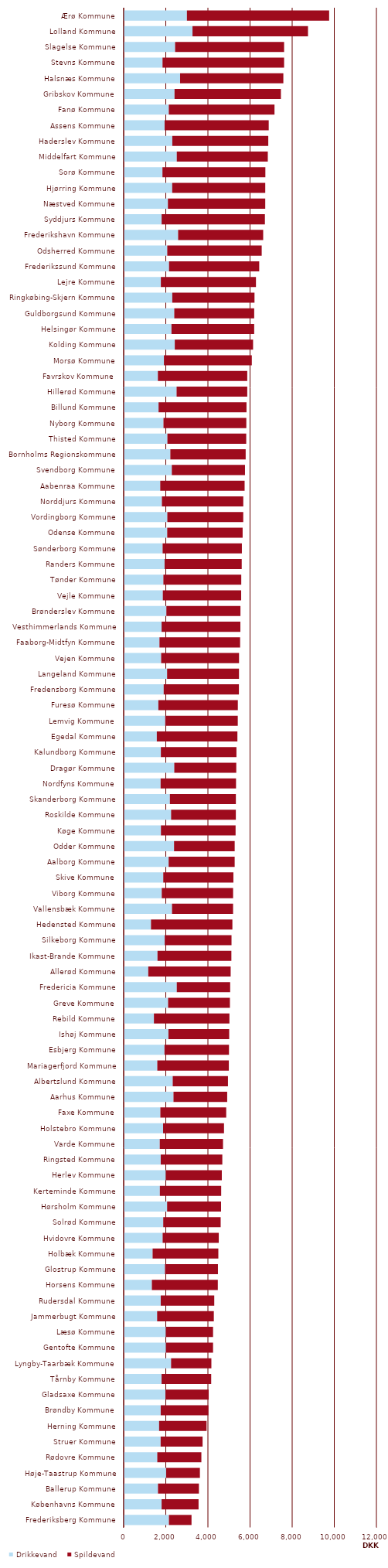
| Category | Drikkevand  | Spildevand  |
|---|---|---|
| Ærø Kommune | 3003.023 | 6752.506 |
| Lolland Kommune | 3268.256 | 5483.514 |
| Slagelse Kommune | 2441.804 | 5175.673 |
| Stevns Kommune | 1844.837 | 5772.29 |
| Halsnæs Kommune | 2679.196 | 4902.446 |
| Gribskov Kommune | 2414.707 | 5050.891 |
| Fanø Kommune | 2141.904 | 5019.664 |
| Assens Kommune | 1943.949 | 4943.091 |
| Haderslev Kommune | 2309.295 | 4556.58 |
| Middelfart Kommune | 2521.702 | 4321.898 |
| Sorø Kommune | 1841.438 | 4886.076 |
| Hjørring Kommune | 2304.075 | 4418.532 |
| Næstved Kommune | 2100.276 | 4621.734 |
| Syddjurs Kommune | 1801.879 | 4904.085 |
| Frederikshavn Kommune | 2585.25 | 4038.69 |
| Odsherred Kommune | 2069.411 | 4484.218 |
| Frederikssund Kommune | 2153.869 | 4282.039 |
| Lejre Kommune | 1765.447 | 4515.634 |
| Ringkøbing-Skjern Kommune | 2308.084 | 3903.972 |
| Guldborgsund Kommune | 2402.394 | 3795.178 |
| Helsingør Kommune | 2269.515 | 3927.238 |
| Kolding Kommune | 2426.442 | 3717.963 |
| Morsø Kommune | 1911.782 | 4172.805 |
| Favrskov Kommune | 1624.23 | 4243.668 |
| Hillerød Kommune | 2512.826 | 3354.86 |
| Billund Kommune | 1656.771 | 4175.118 |
| Nyborg Kommune | 1890.137 | 3933.49 |
| Thisted Kommune | 2076.008 | 3743.18 |
| Bornholms Regionskommune | 2215.985 | 3576.889 |
| Svendborg Kommune | 2285.736 | 3474.988 |
| Aabenraa Kommune | 1736.648 | 4006.07 |
| Norddjurs Kommune | 1814.651 | 3864.794 |
| Vordingborg Kommune | 2072.612 | 3604.86 |
| Odense Kommune | 2067.35 | 3581.269 |
| Sønderborg Kommune | 1849.519 | 3763.734 |
| Randers Kommune | 1942.928 | 3662.438 |
| Tønder Kommune | 1885.963 | 3697.246 |
| Vejle Kommune | 1858.741 | 3720.072 |
| Brønderslev Kommune | 2027.016 | 3518.409 |
| Vesthimmerlands Kommune | 1800.407 | 3741.047 |
| Faaborg-Midtfyn Kommune | 1699.734 | 3829.148 |
| Vejen Kommune | 1779.517 | 3698.406 |
| Langeland Kommune | 2062.023 | 3413.324 |
| Fredensborg Kommune | 1899.569 | 3572.087 |
| Furesø Kommune | 1646.702 | 3774.217 |
| Lemvig Kommune | 1972.523 | 3445.399 |
| Egedal Kommune | 1573.229 | 3826.637 |
| Kalundborg Kommune | 1766.055 | 3588.652 |
| Dragør Kommune | 2402.695 | 2943.89 |
| Nordfyns Kommune | 1753.683 | 3581.269 |
| Skanderborg Kommune | 2194.079 | 3133.324 |
| Roskilde Kommune | 2251.959 | 3073.89 |
| Køge Kommune | 1768.951 | 3545.248 |
| Odder Kommune | 2391.944 | 2879.047 |
| Aalborg Kommune | 2135.2 | 3135.298 |
| Skive Kommune | 1880.572 | 3329.654 |
| Viborg Kommune | 1807.468 | 3388.409 |
| Vallensbæk Kommune | 2295.175 | 2899.438 |
| Hedensted Kommune | 1297.028 | 3865.181 |
| Silkeborg Kommune | 1948.072 | 3172.395 |
| Ikast-Brande Kommune | 1606.013 | 3508.083 |
| Allerød Kommune | 1167.586 | 3912.605 |
| Fredericia Kommune | 2521.702 | 2534.691 |
| Greve Kommune | 2109.475 | 2935.502 |
| Rebild Kommune | 1436.305 | 3585.502 |
| Ishøj Kommune | 2125.496 | 2885.18 |
| Esbjerg Kommune | 1937.631 | 3062.676 |
| Mariagerfjord Kommune | 1596.495 | 3396.792 |
| Albertslund Kommune | 2329.047 | 2623.081 |
| Aarhus Kommune | 2365.595 | 2549.694 |
| Faxe Kommune | 1741.526 | 3127.073 |
| Holstebro Kommune | 1872.037 | 2891.909 |
| Varde Kommune | 1714.261 | 3002.902 |
| Ringsted Kommune | 1759.818 | 2923.97 |
| Herlev Kommune | 2003.48 | 2656.63 |
| Kerteminde Kommune | 1718.538 | 2911.306 |
| Hørsholm Kommune | 2062.4 | 2561.436 |
| Solrød Kommune | 1879.356 | 2725.824 |
| Hvidovre Kommune | 1850.415 | 2665.017 |
| Holbæk Kommune | 1374.275 | 3120.502 |
| Glostrup Kommune | 1960.18 | 2516.145 |
| Horsens Kommune | 1339.002 | 3131.306 |
| Rudersdal Kommune | 1759.964 | 2541.306 |
| Jammerbugt Kommune | 1588.607 | 2692.174 |
| Læsø Kommune | 2004.36 | 2239.729 |
| Gentofte Kommune | 2008.722 | 2235.175 |
| Lyngby-Taarbæk Kommune | 2250.901 | 1913.319 |
| Tårnby Kommune | 1799.486 | 2355.95 |
| Gladsaxe Kommune | 1983.561 | 2054.852 |
| Brøndby Kommune | 1758.397 | 2264.53 |
| Herning Kommune | 1682.475 | 2254.047 |
| Struer Kommune | 1755.081 | 1991.948 |
| Rødovre Kommune | 1595.655 | 2093.642 |
| Høje-Taastrup Kommune | 2017.11 | 1602.994 |
| Ballerup Kommune | 1629.623 | 1943.303 |
| Københavns Kommune | 1800.976 | 1755.011 |
| Frederiksberg Kommune | 2148.076 | 1073.555 |